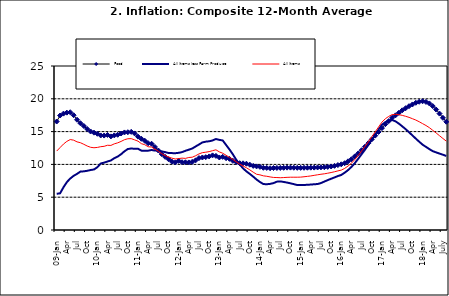
| Category | Food | All Items less Farm Produce | All Items |
|---|---|---|---|
| 09-Jan | 16.536 | 5.519 | 12.032 |
| Feb | 17.454 | 5.591 | 12.567 |
| Mar | 17.742 | 6.51 | 13.101 |
| Apr | 17.89 | 7.302 | 13.51 |
| May | 17.949 | 7.847 | 13.787 |
| June | 17.498 | 8.259 | 13.694 |
| Jul | 16.808 | 8.554 | 13.437 |
| Aug | 16.278 | 8.906 | 13.307 |
| Sep | 15.859 | 8.942 | 13.065 |
| Oct | 15.396 | 9.024 | 12.803 |
| Nov | 15.018 | 9.143 | 12.609 |
| Dec | 14.841 | 9.226 | 12.538 |
| 10-Jan | 14.668 | 9.567 | 12.586 |
| Feb | 14.411 | 10.138 | 12.7 |
| Mar | 14.395 | 10.269 | 12.757 |
| Apr | 14.489 | 10.444 | 12.915 |
| May | 14.266 | 10.597 | 12.893 |
| Jun | 14.424 | 10.948 | 13.132 |
| Jul | 14.514 | 11.193 | 13.284 |
| Aug | 14.706 | 11.549 | 13.5 |
| Sep | 14.872 | 11.997 | 13.764 |
| Oct | 14.906 | 12.345 | 13.908 |
| Nov | 14.967 | 12.423 | 13.928 |
| Dec | 14.723 | 12.383 | 13.74 |
| 11-Jan | 14.233 | 12.385 | 13.542 |
| Feb | 13.903 | 12.099 | 13.161 |
| Mar | 13.606 | 12.077 | 13.001 |
| Apr | 13.227 | 12.088 | 12.694 |
| May | 13.152 | 12.198 | 12.648 |
| Jun | 12.654 | 12.1 | 12.321 |
| Jul | 12.118 | 12.109 | 12.009 |
| Aug | 11.575 | 11.98 | 11.635 |
| Sep | 11.155 | 11.877 | 11.363 |
| Oct | 10.797 | 11.746 | 11.13 |
| Nov | 10.422 | 11.721 | 10.952 |
| Dec | 10.298 | 11.706 | 10.826 |
| 12-Jan | 10.538 | 11.765 | 10.886 |
| 12-Feb | 10.336 | 11.872 | 10.955 |
| 12-Mar | 10.325 | 12.075 | 10.914 |
| Apr | 10.304 | 12.242 | 11.054 |
| May | 10.387 | 12.419 | 11.096 |
| Jun | 10.617 | 12.732 | 11.32 |
| Jul | 10.963 | 13.032 | 11.599 |
| Aug | 11.056 | 13.349 | 11.791 |
| Sep | 11.104 | 13.467 | 11.859 |
| Oct | 11.216 | 13.525 | 11.948 |
| Nov | 11.372 | 13.649 | 12.091 |
| Dec | 11.296 | 13.873 | 12.224 |
| 13-Jan | 11.055 | 13.737 | 11.908 |
| Feb | 11.153 | 13.657 | 11.703 |
| Mar | 10.951 | 12.963 | 11.394 |
| Apr | 10.844 | 12.281 | 11.072 |
| May | 10.548 | 11.531 | 10.761 |
| Jun | 10.352 | 10.704 | 10.383 |
| Jul | 10.186 | 10.005 | 10.047 |
| Aug | 10.168 | 9.4 | 9.761 |
| Sep | 10.105 | 8.939 | 9.486 |
| Oct | 9.955 | 8.553 | 9.167 |
| Nov | 9.774 | 8.136 | 8.815 |
| Dec | 9.695 | 7.691 | 8.496 |
| 14-Jan | 9.626 | 7.317 | 8.408 |
| Feb | 9.484 | 7.005 | 8.257 |
| Mar | 9.464 | 6.976 | 8.19 |
| Apr | 9.416 | 7.03 | 8.092 |
| May | 9.448 | 7.151 | 8.012 |
| Jun | 9.464 | 7.369 | 7.998 |
| Jul | 9.459 | 7.411 | 7.968 |
| Aug | 9.481 | 7.325 | 7.996 |
| Sep | 9.501 | 7.228 | 8.027 |
| Oct | 9.508 | 7.116 | 8.047 |
| Nov | 9.492 | 6.991 | 8.046 |
| Dec | 9.481 | 6.854 | 8.047 |
| 15-Jan | 9.475 | 6.865 | 8.063 |
| Feb | 9.486 | 6.852 | 8.117 |
| Mar | 9.495 | 6.905 | 8.176 |
| Apr | 9.501 | 6.922 | 8.243 |
| May | 9.51 | 6.975 | 8.331 |
| Jun | 9.535 | 7.006 | 8.417 |
| Jul | 9.552 | 7.154 | 8.497 |
| Aug | 9.571 | 7.384 | 8.566 |
| Sep | 9.614 | 7.605 | 8.658 |
| Oct | 9.68 | 7.812 | 8.76 |
| Nov | 9.778 | 8.016 | 8.879 |
| Dec | 9.898 | 8.222 | 9.009 |
| 16-Jan | 10.017 | 8.391 | 9.13 |
| Feb | 10.184 | 8.732 | 9.386 |
| Mar | 10.471 | 9.132 | 9.751 |
| Apr | 10.786 | 9.614 | 10.182 |
| May | 11.221 | 10.196 | 10.746 |
| Jun | 11.672 | 10.864 | 11.372 |
| Jul | 12.162 | 11.553 | 12.045 |
| Aug | 12.696 | 12.247 | 12.744 |
| Sep | 13.238 | 12.98 | 13.454 |
| Oct | 13.817 | 13.757 | 14.206 |
| Nov | 14.386 | 14.542 | 14.958 |
| Dec | 14.946 | 15.307 | 15.697 |
| 17-Jan | 15.536 | 16.042 | 16.441 |
| Feb | 16.127 | 16.436 | 16.958 |
| Mar | 16.598 | 16.682 | 17.315 |
| Apr | 17.106 | 16.772 | 17.591 |
| May | 17.477 | 16.567 | 17.628 |
| Jun | 17.868 | 16.219 | 17.578 |
| Jul | 18.247 | 15.798 | 17.475 |
| Aug | 18.569 | 15.372 | 17.331 |
| Sep | 18.876 | 14.903 | 17.17 |
| Oct | 19.14 | 14.415 | 16.968 |
| Nov | 19.392 | 13.93 | 16.76 |
| Dec | 19.546 | 13.458 | 16.502 |
| 18-Jan | 19.621 | 13.01 | 16.215 |
| Feb | 19.521 | 12.668 | 15.93 |
| Mar | 19.294 | 12.33 | 15.599 |
| Apr | 18.886 | 12.021 | 15.196 |
| May | 18.359 | 11.828 | 14.793 |
| June | 17.745 | 11.651 | 14.371 |
| July | 17.102 | 11.478 | 13.95 |
| August | 16.501 | 11.285 | 13.546 |